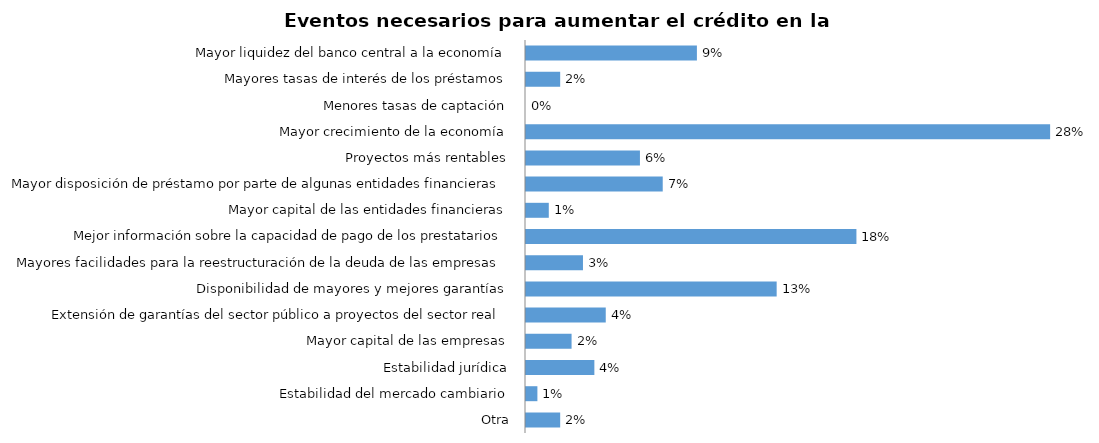
| Category | Series 0 |
|---|---|
| Mayor liquidez del banco central a la economía | 0.091 |
| Mayores tasas de interés de los préstamos | 0.018 |
| Menores tasas de captación | 0 |
| Mayor crecimiento de la economía | 0.279 |
| Proyectos más rentables | 0.061 |
| Mayor disposición de préstamo por parte de algunas entidades financieras | 0.073 |
| Mayor capital de las entidades financieras | 0.012 |
| Mejor información sobre la capacidad de pago de los prestatarios | 0.176 |
| Mayores facilidades para la reestructuración de la deuda de las empresas | 0.03 |
| Disponibilidad de mayores y mejores garantías | 0.133 |
| Extensión de garantías del sector público a proyectos del sector real | 0.042 |
| Mayor capital de las empresas | 0.024 |
| Estabilidad jurídica | 0.036 |
| Estabilidad del mercado cambiario | 0.006 |
| Otra | 0.018 |